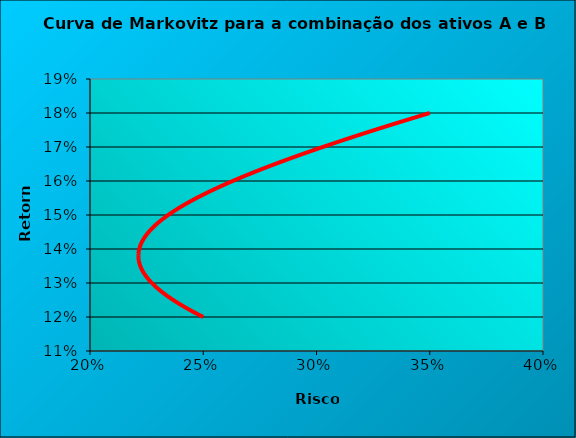
| Category | Series 0 |
|---|---|
| 0.3500000000000002 | 0.18 |
| 0.347008645425442 | 0.179 |
| 0.34403488195239756 | 0.179 |
| 0.34107916969524854 | 0.178 |
| 0.33814198201347334 | 0.178 |
| 0.3352238058372348 | 0.177 |
| 0.33232514199199575 | 0.176 |
| 0.3294465055210028 | 0.176 |
| 0.326588426004352 | 0.175 |
| 0.3237514478732105 | 0.175 |
| 0.32093613071762445 | 0.174 |
| 0.31814304958618866 | 0.173 |
| 0.31537279527568657 | 0.173 |
| 0.31262597460863695 | 0.172 |
| 0.30990321069650134 | 0.172 |
| 0.30720514318611286 | 0.171 |
| 0.3045324284866886 | 0.17 |
| 0.3018857399745806 | 0.17 |
| 0.29926576817270645 | 0.169 |
| 0.2966732209013818 | 0.169 |
| 0.294108823397055 | 0.168 |
| 0.29157331839521955 | 0.167 |
| 0.2890674661735563 | 0.167 |
| 0.28659204455113557 | 0.166 |
| 0.28414784883929717 | 0.166 |
| 0.28173569173961627 | 0.165 |
| 0.2793564031841763 | 0.164 |
| 0.2770108301131926 | 0.164 |
| 0.2746998361848803 | 0.163 |
| 0.2724243014123374 | 0.163 |
| 0.27018512172212605 | 0.162 |
| 0.2679832084291851 | 0.161 |
| 0.26581948762271 | 0.161 |
| 0.26369489945768776 | 0.16 |
| 0.26161039734689456 | 0.16 |
| 0.2595669470483483 | 0.159 |
| 0.2575655256434759 | 0.158 |
| 0.25560712040160394 | 0.158 |
| 0.25369272752682537 | 0.157 |
| 0.2518233507838383 | 0.157 |
| 0.2500000000000001 | 0.156 |
| 0.24822368944160034 | 0.155 |
| 0.24649543606322624 | 0.155 |
| 0.2448162576300848 | 0.154 |
| 0.24318717071424648 | 0.154 |
| 0.24160918856699148 | 0.153 |
| 0.24008331887076215 | 0.152 |
| 0.23861056137564415 | 0.152 |
| 0.23719190542680846 | 0.151 |
| 0.23582832739092233 | 0.151 |
| 0.23452078799117157 | 0.15 |
| 0.23327022956219692 | 0.149 |
| 0.23207757323791553 | 0.149 |
| 0.23094371608684236 | 0.148 |
| 0.2298695282111138 | 0.148 |
| 0.22885584982691629 | 0.147 |
| 0.22790348834539598 | 0.146 |
| 0.22701321547434203 | 0.146 |
| 0.22618576436195106 | 0.145 |
| 0.22542182680477071 | 0.145 |
| 0.22472205054244243 | 0.144 |
| 0.2240870366620971 | 0.143 |
| 0.22351733713517627 | 0.143 |
| 0.22301345250903598 | 0.142 |
| 0.22257582977493323 | 0.142 |
| 0.2222048604328898 | 0.141 |
| 0.22190087877248266 | 0.14 |
| 0.22166416038683398 | 0.14 |
| 0.22149492093499581 | 0.139 |
| 0.22139331516556693 | 0.139 |
| 0.22135943621178666 | 0.138 |
| 0.22139331516556693 | 0.137 |
| 0.22149492093499581 | 0.137 |
| 0.22166416038683395 | 0.136 |
| 0.22190087877248266 | 0.136 |
| 0.22220486043288984 | 0.135 |
| 0.22257582977493323 | 0.134 |
| 0.22301345250903598 | 0.134 |
| 0.22351733713517627 | 0.133 |
| 0.22408703666209712 | 0.133 |
| 0.22472205054244246 | 0.132 |
| 0.22542182680477074 | 0.131 |
| 0.22618576436195106 | 0.131 |
| 0.22701321547434206 | 0.13 |
| 0.227903488345396 | 0.13 |
| 0.22885584982691629 | 0.129 |
| 0.22986952821111384 | 0.128 |
| 0.2309437160868424 | 0.128 |
| 0.23207757323791559 | 0.127 |
| 0.23327022956219695 | 0.127 |
| 0.23452078799117163 | 0.126 |
| 0.23582832739092238 | 0.125 |
| 0.23719190542680849 | 0.125 |
| 0.2386105613756442 | 0.124 |
| 0.24008331887076217 | 0.124 |
| 0.24160918856699154 | 0.123 |
| 0.2431871707142465 | 0.122 |
| 0.24481625763008485 | 0.122 |
| 0.2464954360632263 | 0.121 |
| 0.2482236894416004 | 0.121 |
| 0.25000000000000017 | 0.12 |